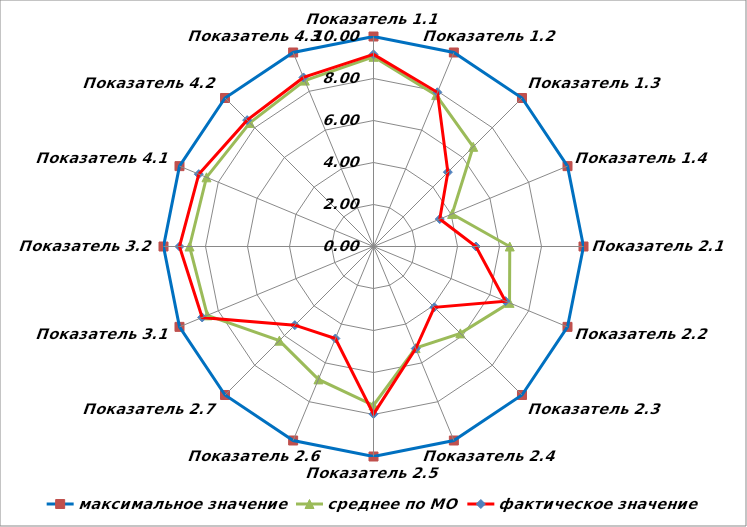
| Category | максимальное значение | среднее по МО | фактическое значение |
|---|---|---|---|
| Показатель 1.1 | 10 | 9.033 | 9.148 |
| Показатель 1.2 | 10 | 7.803 | 7.948 |
| Показатель 1.3 | 10 | 6.713 | 5.007 |
| Показатель 1.4 | 10 | 4.051 | 3.415 |
| Показатель 2.1 | 10 | 6.489 | 4.877 |
| Показатель 2.2 | 10 | 7.011 | 6.802 |
| Показатель 2.3 | 10 | 5.851 | 4.095 |
| Показатель 2.4 | 10 | 5.239 | 5.258 |
| Показатель 2.5 | 10 | 7.56 | 7.982 |
| Показатель 2.6 | 10 | 6.849 | 4.741 |
| Показатель 2.7 | 10 | 6.342 | 5.297 |
| Показатель 3.1 | 10 | 8.563 | 8.83 |
| Показатель 3.2 | 10 | 8.76 | 9.24 |
| Показатель 4.1 | 10 | 8.608 | 9.004 |
| Показатель 4.2 | 10 | 8.323 | 8.509 |
| Показатель 4.3 | 10 | 8.551 | 8.713 |